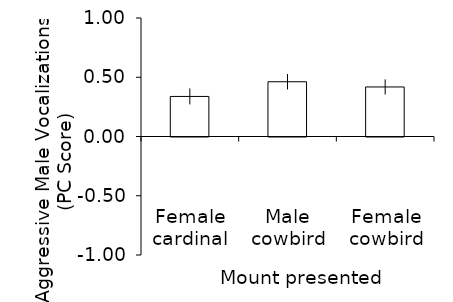
| Category | Series 0 |
|---|---|
| Female cardinal | 0.338 |
| Male cowbird | 0.462 |
| Female cowbird | 0.418 |